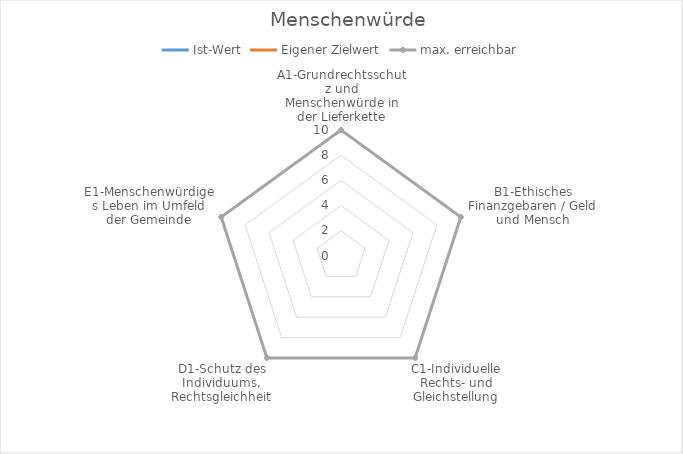
| Category | Ist-Wert | Eigener Zielwert | max. erreichbar |
|---|---|---|---|
| A1-Grundrechtsschutz und Menschenwürde in der Lieferkette | 0 | 0 | 10 |
| B1-Ethisches Finanzgebaren / Geld und Mensch | 0 | 0 | 10 |
| C1-Individuelle Rechts- und Gleichstellung | 0 | 0 | 10 |
| D1-Schutz des Individuums, Rechtsgleichheit | 0 | 0 | 10 |
| E1-Menschenwürdiges Leben im Umfeld der Gemeinde | 0 | 0 | 10 |